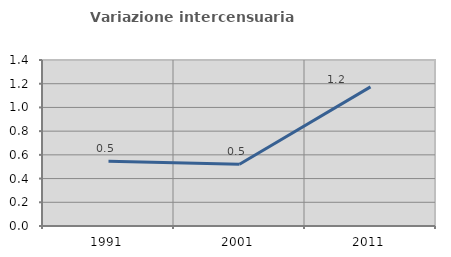
| Category | Variazione intercensuaria annua |
|---|---|
| 1991.0 | 0.546 |
| 2001.0 | 0.521 |
| 2011.0 | 1.173 |